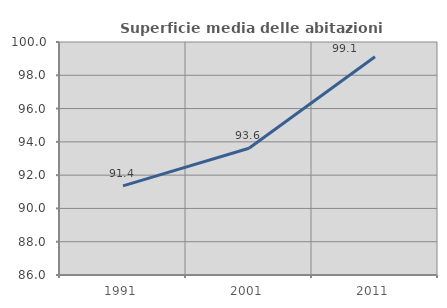
| Category | Superficie media delle abitazioni occupate |
|---|---|
| 1991.0 | 91.357 |
| 2001.0 | 93.617 |
| 2011.0 | 99.114 |